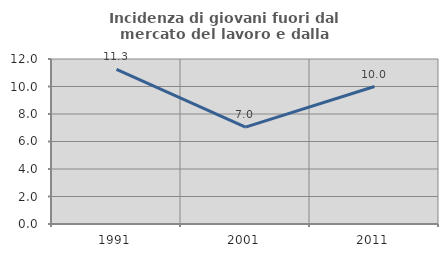
| Category | Incidenza di giovani fuori dal mercato del lavoro e dalla formazione  |
|---|---|
| 1991.0 | 11.25 |
| 2001.0 | 7.042 |
| 2011.0 | 10 |